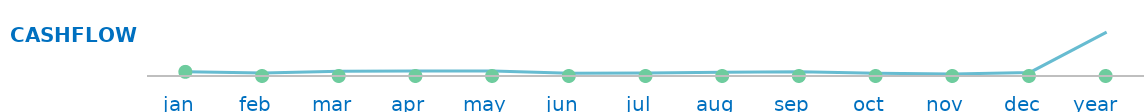
| Category | Cash Flow |
|---|---|
| jan  | 169 |
| feb  | 121 |
| mar  | 192 |
| apr  | 199 |
| may  | 204 |
| jun  | 109 |
| jul  | 124 |
| aug  | 154 |
| sep  | 178 |
| oct  | 109 |
| nov  | 85 |
| dec  | 146 |
| year   | 1790 |